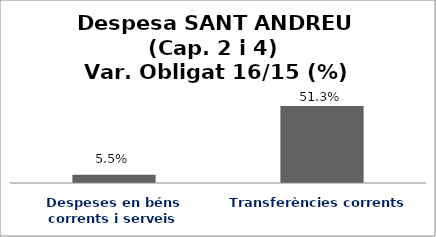
| Category | Series 0 |
|---|---|
| Despeses en béns corrents i serveis | 0.055 |
| Transferències corrents | 0.513 |